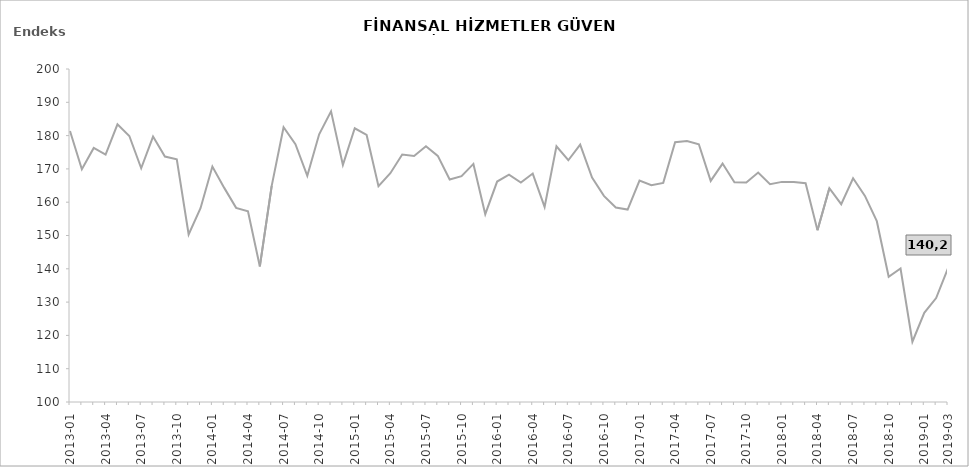
| Category | FHGE |
|---|---|
| 2013-01 | 181.4 |
|  | 169.9 |
|  | 176.3 |
| 2013-04 | 174.3 |
|  | 183.4 |
|  | 179.9 |
| 2013-07 | 170.2 |
|  | 179.7 |
|  | 173.7 |
| 2013-10 | 172.9 |
|  | 150.3 |
|  | 158.2 |
| 2014-01 | 170.7 |
|  | 164.3 |
|  | 158.3 |
| 2014-04 | 157.3 |
|  | 140.7 |
|  | 164.9 |
| 2014-07 | 182.5 |
|  | 177.4 |
|  | 167.9 |
| 2014-10 | 180.4 |
|  | 187.3 |
|  | 171.2 |
| 2015-01 | 182.2 |
|  | 180.2 |
|  | 164.8 |
| 2015-04 | 168.7 |
|  | 174.3 |
|  | 173.9 |
| 2015-07 | 176.8 |
|  | 173.9 |
|  | 166.8 |
| 2015-10 | 167.8 |
|  | 171.5 |
|  | 156.4 |
| 2016-01 | 166.2 |
|  | 168.3 |
|  | 165.9 |
| 2016-04 | 168.6 |
|  | 158.6 |
|  | 176.8 |
| 2016-07 | 172.6 |
|  | 177.3 |
|  | 167.4 |
| 2016-10 | 161.9 |
|  | 158.4 |
|  | 157.8 |
| 2017-01 | 166.5 |
|  | 165.1 |
|  | 165.8 |
| 2017-04 | 178 |
|  | 178.4 |
|  | 177.4 |
| 2017-07 | 166.4 |
|  | 171.6 |
|  | 166 |
| 2017-10 | 165.9 |
|  | 168.9 |
|  | 165.4 |
| 2018-01 | 166.1 |
|  | 166.1 |
|  | 165.7 |
| 2018-04 | 151.6 |
|  | 164.2 |
|  | 159.4 |
| 2018-07 | 167.2 |
|  | 161.9 |
|  | 154.3 |
| 2018-10 | 137.6 |
|  | 140.1 |
|  | 118.1 |
| 2019-01 | 126.8 |
|  | 131.2 |
| 2019-03 | 140.2 |